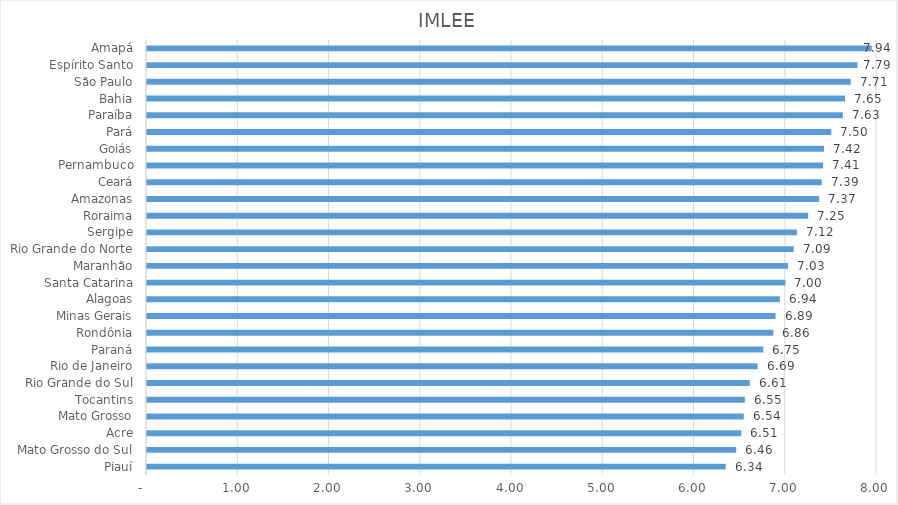
| Category | IMLEE |
|---|---|
| Piauí | 6.343 |
| Mato Grosso do Sul | 6.457 |
| Acre | 6.513 |
| Mato Grosso | 6.54 |
| Tocantins | 6.552 |
| Rio Grande do Sul | 6.606 |
| Rio de Janeiro | 6.691 |
| Paraná | 6.754 |
| Rondônia | 6.863 |
| Minas Gerais | 6.888 |
| Alagoas | 6.936 |
| Santa Catarina | 6.997 |
| Maranhão | 7.025 |
| Rio Grande do Norte | 7.087 |
| Sergipe | 7.122 |
| Roraima | 7.246 |
| Amazonas | 7.365 |
| Ceará | 7.394 |
| Pernambuco | 7.409 |
| Goiás | 7.419 |
| Pará | 7.5 |
| Paraíba | 7.626 |
| Bahia | 7.65 |
| São Paulo | 7.712 |
| Espírito Santo | 7.785 |
| Amapá | 7.942 |